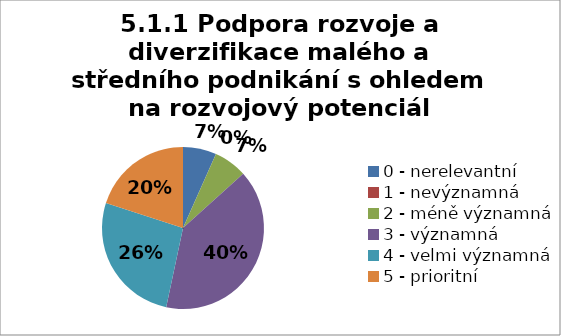
| Category | Series 4 | Series 3 | Series 2 | Series 1 | Series 0 |
|---|---|---|---|---|---|
| 0 - nerelevantní | 6.667 | 0 | 0 | 0 | 0 |
| 1 - nevýznamná | 0 | 0 | 6.667 | 0 | 0 |
| 2 - méně významná | 6.667 | 26.667 | 0 | 6.667 | 0 |
| 3 - významná | 40 | 46.667 | 53.333 | 46.667 | 33.333 |
| 4 - velmi významná | 26.667 | 13.333 | 40 | 33.333 | 40 |
| 5 - prioritní | 20 | 13.333 | 0 | 13.333 | 26.667 |